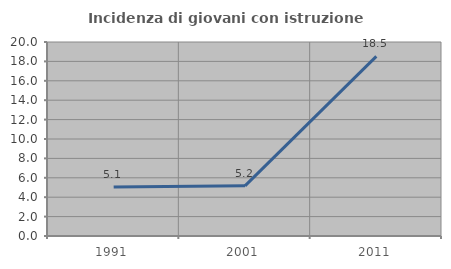
| Category | Incidenza di giovani con istruzione universitaria |
|---|---|
| 1991.0 | 5.063 |
| 2001.0 | 5.172 |
| 2011.0 | 18.519 |